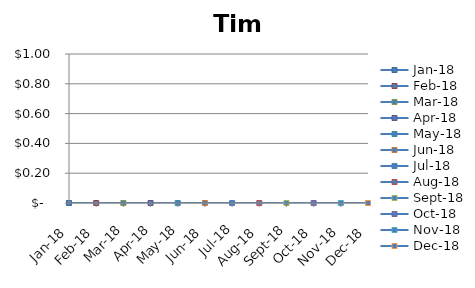
| Category | Tim Hortons |
|---|---|
| 2018-01-01 | 0 |
| 2018-02-01 | 0 |
| 2018-03-01 | 0 |
| 2018-04-01 | 0 |
| 2018-05-01 | 0 |
| 2018-06-01 | 0 |
| 2018-07-01 | 0 |
| 2018-08-01 | 0 |
| 2018-09-01 | 0 |
| 2018-10-01 | 0 |
| 2018-11-01 | 0 |
| 2018-12-01 | 0 |